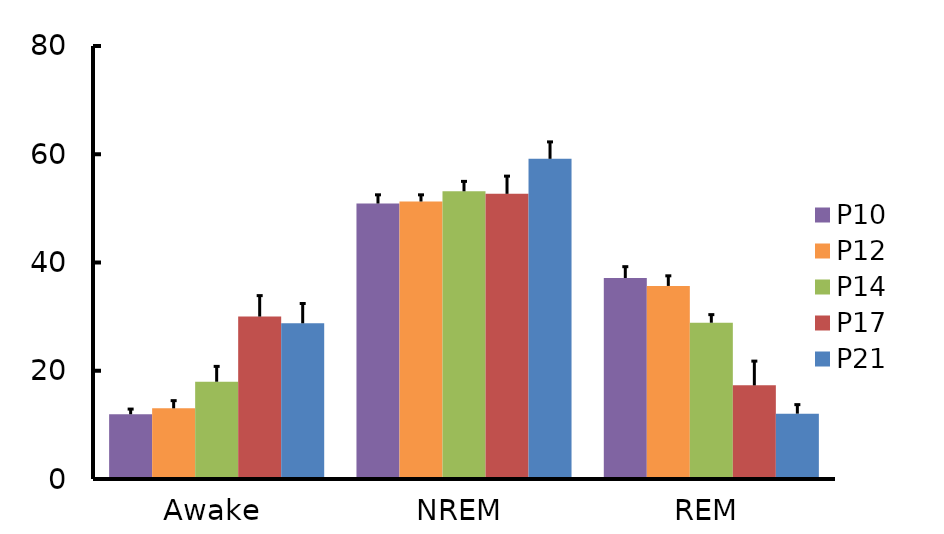
| Category | P10 | P12 | P14 | P17 | P21 |
|---|---|---|---|---|---|
| Awake | 11.964 | 13.06 | 17.973 | 30.012 | 28.77 |
| NREM | 50.897 | 51.269 | 53.155 | 52.688 | 59.157 |
| REM | 37.139 | 35.671 | 28.872 | 17.3 | 12.074 |